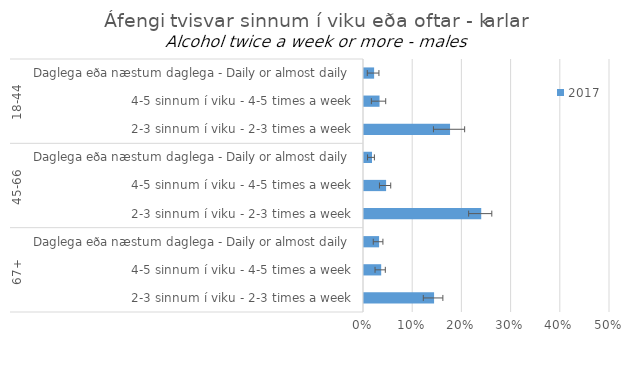
| Category | 2017 |
|---|---|
| 0 | 0.021 |
| 1 | 0.032 |
| 2 | 0.175 |
| 3 | 0.016 |
| 4 | 0.045 |
| 5 | 0.238 |
| 6 | 0.031 |
| 7 | 0.035 |
| 8 | 0.142 |